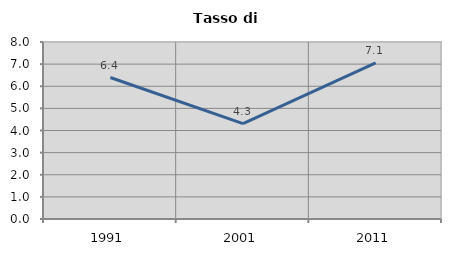
| Category | Tasso di disoccupazione   |
|---|---|
| 1991.0 | 6.395 |
| 2001.0 | 4.308 |
| 2011.0 | 7.053 |